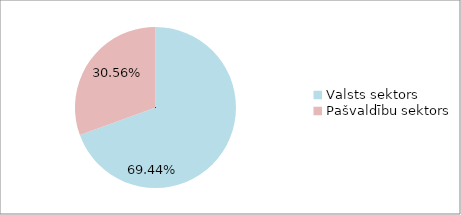
| Category | Series 0 |
|---|---|
| Valsts sektors | 0.694 |
| Pašvaldību sektors | 0.306 |